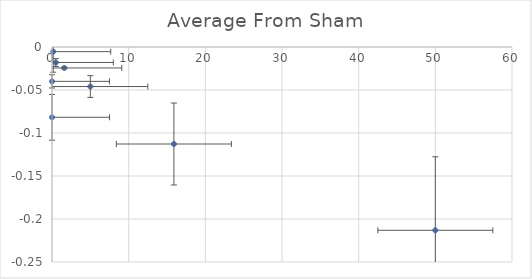
| Category | Average From Sham |
|---|---|
| 50.0 | -0.213 |
| 15.9 | -0.113 |
| 5.0 | -0.046 |
| 1.6 | -0.024 |
| 0.5 | -0.018 |
| 0.16 | -0.005 |
| 0.0 | -0.04 |
| 0.0 | -0.082 |